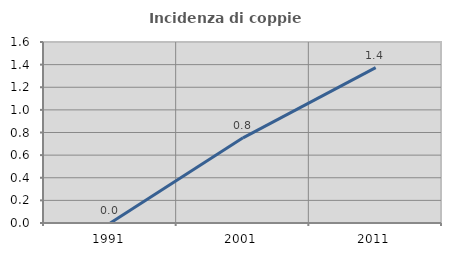
| Category | Incidenza di coppie miste |
|---|---|
| 1991.0 | 0 |
| 2001.0 | 0.753 |
| 2011.0 | 1.374 |